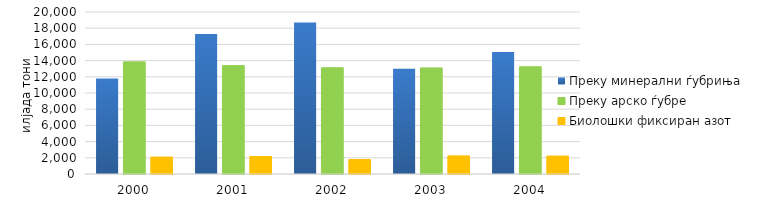
| Category | Преку минерални ѓубриња | Преку арско ѓубре | Биолошки фиксиран азот |
|---|---|---|---|
| 2000.0 | 11798 | 13846 | 2094 |
| 2001.0 | 17289 | 13385 | 2160 |
| 2002.0 | 18716 | 13117 | 1783 |
| 2003.0 | 12999 | 13097 | 2232 |
| 2004.0 | 15072 | 13234 | 2214 |